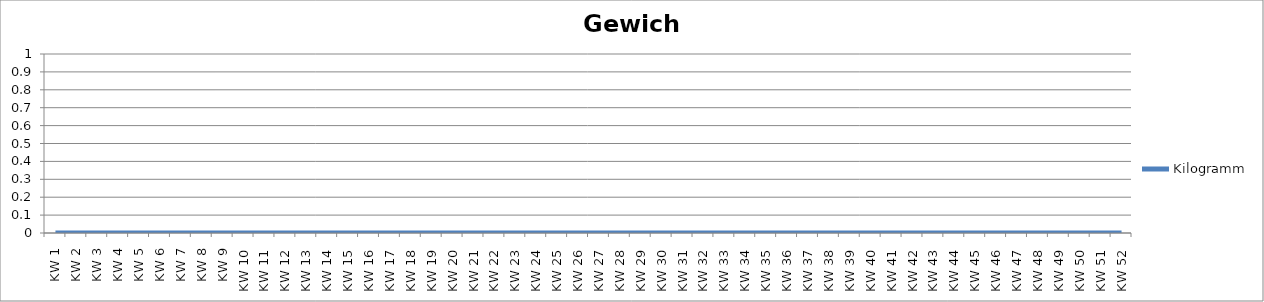
| Category | Kilogramm |
|---|---|
| KW 1 | 0 |
| KW 2 | 0 |
| KW 3 | 0 |
| KW 4 | 0 |
| KW 5 | 0 |
| KW 6 | 0 |
| KW 7 | 0 |
| KW 8 | 0 |
| KW 9 | 0 |
| KW 10 | 0 |
| KW 11 | 0 |
| KW 12 | 0 |
| KW 13 | 0 |
| KW 14 | 0 |
| KW 15 | 0 |
| KW 16 | 0 |
| KW 17 | 0 |
| KW 18 | 0 |
| KW 19 | 0 |
| KW 20 | 0 |
| KW 21 | 0 |
| KW 22 | 0 |
| KW 23 | 0 |
| KW 24 | 0 |
| KW 25 | 0 |
| KW 26 | 0 |
| KW 27 | 0 |
| KW 28 | 0 |
| KW 29 | 0 |
| KW 30 | 0 |
| KW 31 | 0 |
| KW 32 | 0 |
| KW 33 | 0 |
| KW 34 | 0 |
| KW 35 | 0 |
| KW 36 | 0 |
| KW 37 | 0 |
| KW 38 | 0 |
| KW 39 | 0 |
| KW 40 | 0 |
| KW 41 | 0 |
| KW 42 | 0 |
| KW 43 | 0 |
| KW 44 | 0 |
| KW 45 | 0 |
| KW 46 | 0 |
| KW 47 | 0 |
| KW 48 | 0 |
| KW 49 | 0 |
| KW 50 | 0 |
| KW 51 | 0 |
| KW 52 | 0 |